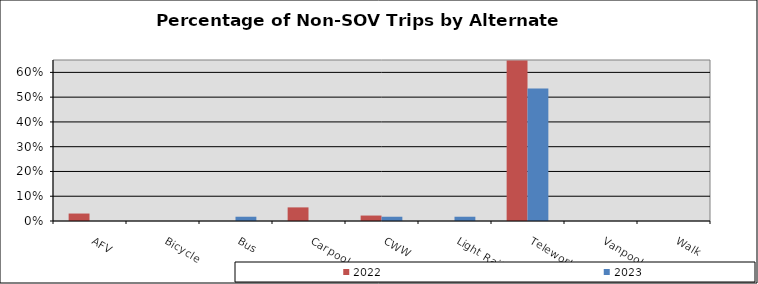
| Category | 2022 | 2023 |
|---|---|---|
| AFV | 0.03 | 0 |
| Bicycle | 0 | 0 |
| Bus | 0 | 0.017 |
| Carpool | 0.055 | 0 |
| CWW | 0.022 | 0.017 |
| Light Rail | 0 | 0.017 |
| Telework | 0.648 | 0.534 |
| Vanpool | 0 | 0 |
| Walk | 0 | 0 |